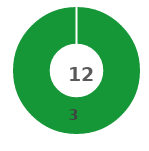
| Category | Series 0 |
|---|---|
| 0 | 3 |
| 1 | 0 |
| 2 | 0 |
| 3 | 0 |
| 4 | 0 |